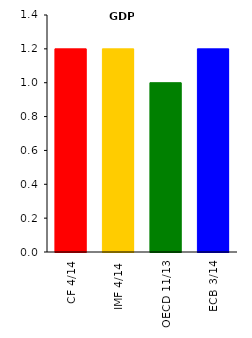
| Category | GDP |
|---|---|
| CF 4/14 | 1.2 |
| IMF 4/14 | 1.2 |
| OECD 11/13 | 1 |
| ECB 3/14 | 1.2 |